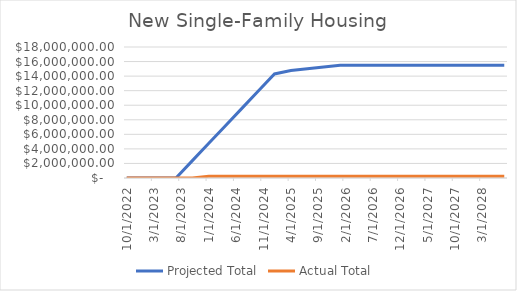
| Category | Projected Total | Actual Total  |
|---|---|---|
| 10/1/22 | 0 | 0 |
| 1/1/23 | 0 | 0 |
| 4/1/23 | 0 | 0 |
| 7/1/23 | 0 | 0 |
| 10/1/23 | 2383831.881 | 0 |
| 1/1/24 | 4767663.762 | 234937.32 |
| 4/1/24 | 7151495.643 | 234937.32 |
| 7/1/24 | 9535327.524 | 234937.32 |
| 10/1/24 | 11919159.405 | 234937.32 |
| 1/1/25 | 14302991.286 | 234937.32 |
| 4/1/25 | 14761259 | 234937.32 |
| 7/1/25 | 15005241 | 234937.32 |
| 10/1/25 | 15249223 | 234937.32 |
| 1/1/26 | 15493205 | 234937.32 |
| 4/1/26 | 15493205 | 234937.32 |
| 7/1/26 | 15493205 | 234937.32 |
| 10/1/26 | 15493205 | 234937.32 |
| 1/1/27 | 15493205 | 234937.32 |
| 4/1/27 | 15493205 | 234937.32 |
| 7/1/27 | 15493205 | 234937.32 |
| 10/1/27 | 15493205 | 234937.32 |
| 1/1/28 | 15493205 | 234937.32 |
| 4/1/28 | 15493205 | 234937.32 |
| 7/1/28 | 15493205 | 234937.32 |